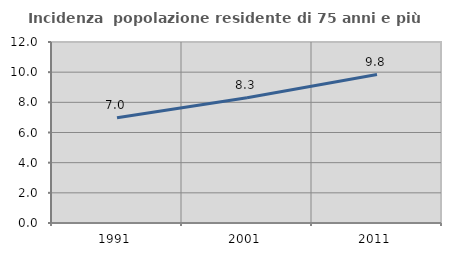
| Category | Incidenza  popolazione residente di 75 anni e più |
|---|---|
| 1991.0 | 6.98 |
| 2001.0 | 8.307 |
| 2011.0 | 9.842 |